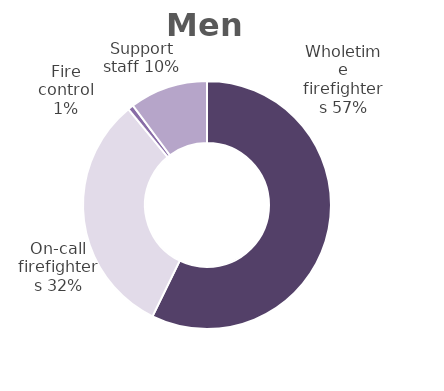
| Category | Men |
|---|---|
| Wholetime firefighters | 0.572 |
| On-call firefighters | 0.318 |
| Fire control | 0.007 |
| Support staff | 0.102 |